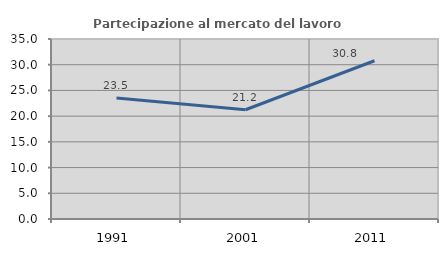
| Category | Partecipazione al mercato del lavoro  femminile |
|---|---|
| 1991.0 | 23.529 |
| 2001.0 | 21.239 |
| 2011.0 | 30.769 |